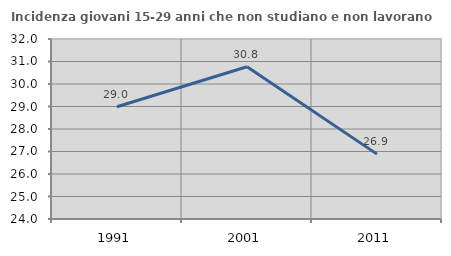
| Category | Incidenza giovani 15-29 anni che non studiano e non lavorano  |
|---|---|
| 1991.0 | 28.989 |
| 2001.0 | 30.769 |
| 2011.0 | 26.883 |